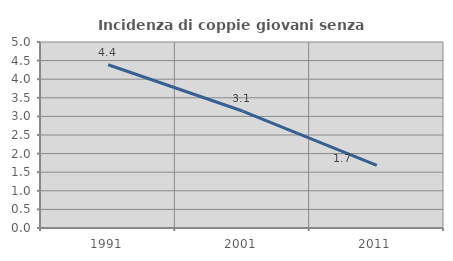
| Category | Incidenza di coppie giovani senza figli |
|---|---|
| 1991.0 | 4.387 |
| 2001.0 | 3.145 |
| 2011.0 | 1.683 |